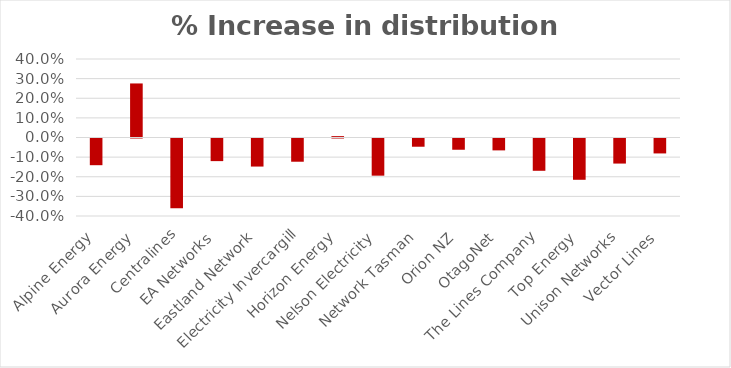
| Category | % Increase in distribution prices |
|---|---|
| Alpine Energy | -0.136 |
| Aurora Energy | 0.275 |
| Centralines | -0.355 |
| EA Networks | -0.115 |
| Eastland Network | -0.143 |
| Electricity Invercargill | -0.118 |
| Horizon Energy | 0.007 |
| Nelson Electricity | -0.189 |
| Network Tasman | -0.042 |
| Orion NZ | -0.057 |
| OtagoNet | -0.061 |
| The Lines Company | -0.165 |
| Top Energy | -0.21 |
| Unison Networks | -0.128 |
| Vector Lines | -0.076 |